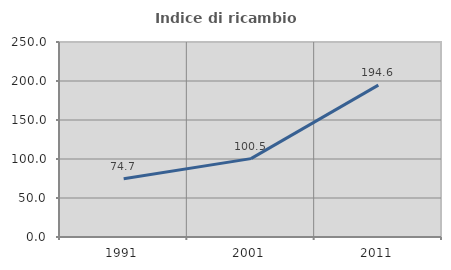
| Category | Indice di ricambio occupazionale  |
|---|---|
| 1991.0 | 74.664 |
| 2001.0 | 100.485 |
| 2011.0 | 194.649 |